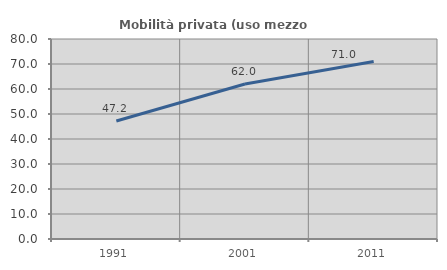
| Category | Mobilità privata (uso mezzo privato) |
|---|---|
| 1991.0 | 47.209 |
| 2001.0 | 61.982 |
| 2011.0 | 70.971 |